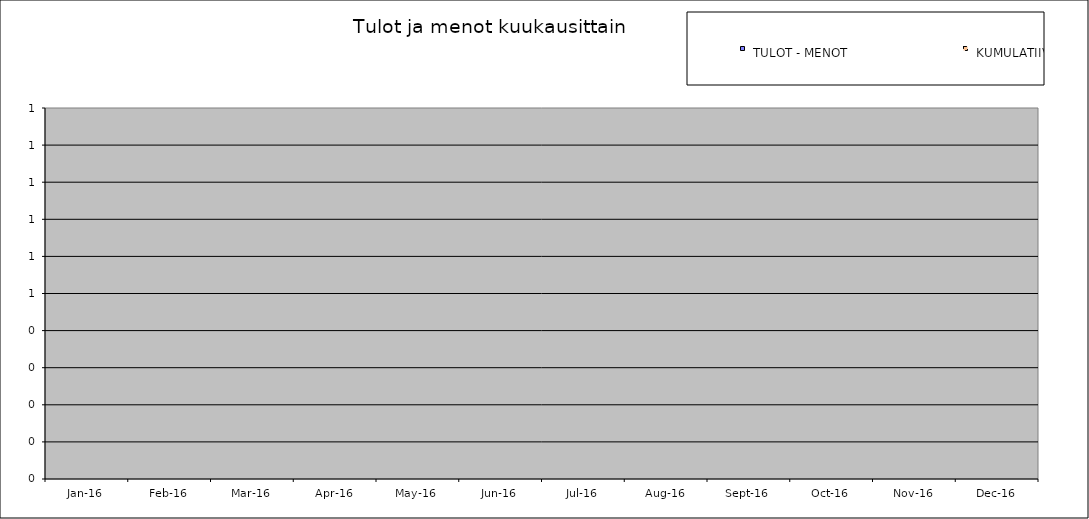
| Category |  TULOT - MENOT |  KUMULATIIVINEN KASSAJÄÄMÄ |
|---|---|---|
| 2016-01-01 | 0 | 0 |
| 2016-02-01 | 0 | 0 |
| 2016-03-03 | 0 | 0 |
| 2016-04-03 | 0 | 0 |
| 2016-05-04 | 0 | 0 |
| 2016-06-04 | 0 | 0 |
| 2016-07-05 | 0 | 0 |
| 2016-08-05 | 0 | 0 |
| 2016-09-05 | 0 | 0 |
| 2016-10-06 | 0 | 0 |
| 2016-11-06 | 0 | 0 |
| 2016-12-07 | 0 | 0 |